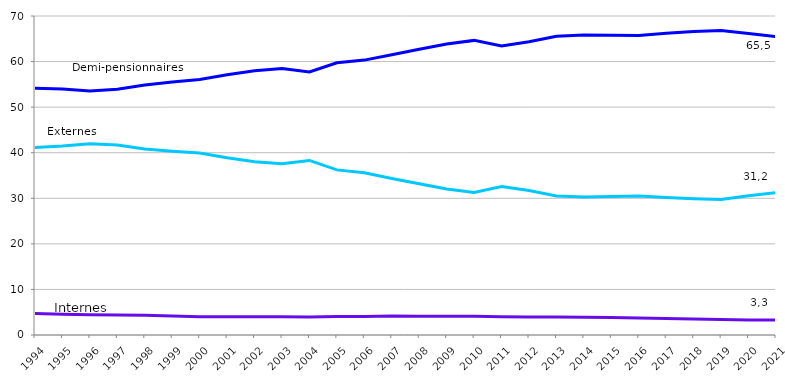
| Category | Demi-pensionnaires | Externes | Internes |
|---|---|---|---|
| 1994.0 | 54.155 | 41.12 | 4.725 |
| 1995.0 | 53.964 | 41.465 | 4.571 |
| 1996.0 | 53.564 | 41.989 | 4.447 |
| 1997.0 | 53.907 | 41.691 | 4.402 |
| 1998.0 | 54.875 | 40.799 | 4.326 |
| 1999.0 | 55.527 | 40.318 | 4.155 |
| 2000.0 | 56.085 | 39.936 | 3.979 |
| 2001.0 | 57.12 | 38.895 | 3.985 |
| 2002.0 | 57.991 | 38.004 | 4.005 |
| 2003.0 | 58.453 | 37.57 | 3.977 |
| 2004.0 | 57.713 | 38.311 | 3.976 |
| 2005.0 | 59.733 | 36.233 | 4.034 |
| 2006.0 | 60.319 | 35.617 | 4.064 |
| 2007.0 | 61.488 | 34.354 | 4.157 |
| 2008.0 | 62.691 | 33.192 | 4.117 |
| 2009.0 | 63.863 | 32.049 | 4.087 |
| 2010.0 | 64.648 | 31.263 | 4.089 |
| 2011.0 | 63.42 | 32.565 | 4.015 |
| 2012.0 | 64.341 | 31.686 | 3.973 |
| 2013.0 | 65.551 | 30.493 | 3.956 |
| 2014.0 | 65.819 | 30.288 | 3.893 |
| 2015.0 | 65.792 | 30.366 | 3.842 |
| 2016.0 | 65.741 | 30.515 | 3.745 |
| 2017.0 | 66.211 | 30.167 | 3.622 |
| 2018.0 | 66.582 | 29.904 | 3.514 |
| 2019.0 | 66.829 | 29.744 | 3.426 |
| 2020.0 | 66.165 | 30.567 | 3.268 |
| 2021.0 | 65.469 | 31.246 | 3.286 |